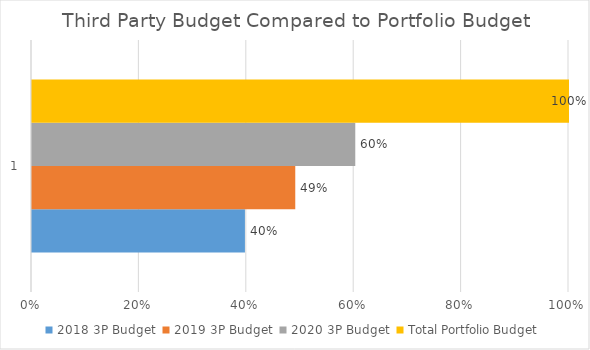
| Category | 2018 3P Budget | 2019 3P Budget | 2020 3P Budget | Total Portfolio Budget |
|---|---|---|---|---|
| 0 | 0.397 | 0.49 | 0.602 | 1 |